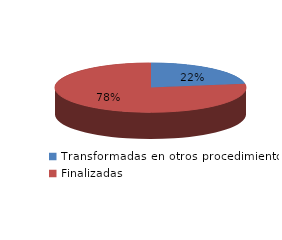
| Category | Series 0 |
|---|---|
| Transformadas en otros procedimientos | 4988 |
| Finalizadas | 17246 |